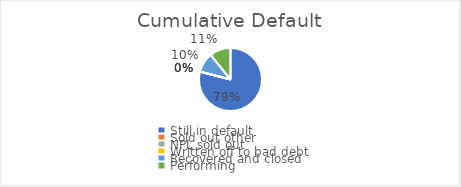
| Category | Series 0 |
|---|---|
| Still in default | 0.79 |
| Sold out other | 0 |
| NPL sold out | 0 |
| Written off to bad debt | 0 |
| Recovered and closed | 0.101 |
| Performing | 0.109 |